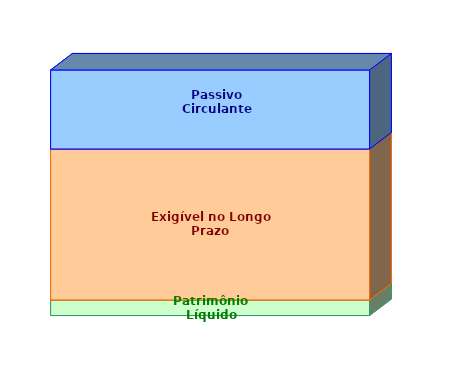
| Category | Patrimônio Líquido | Exigível no Longo Prazo | Passivo Circulante |
|---|---|---|---|
| 0 | 0.063 | 0.615 | 0.322 |